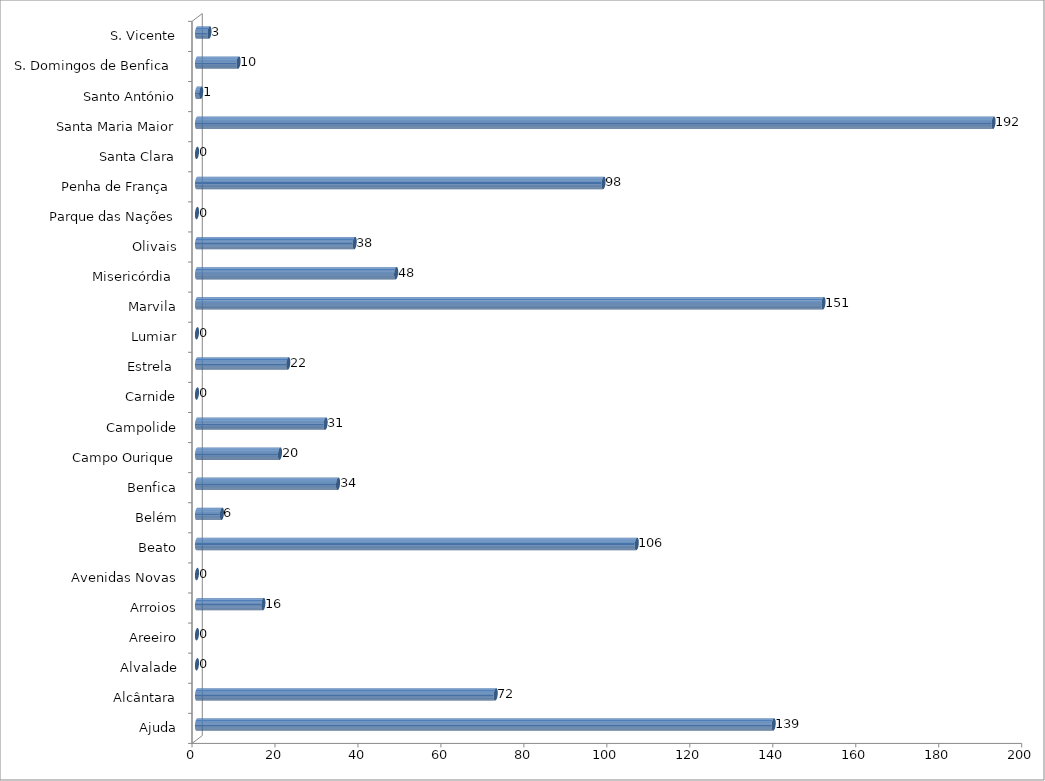
| Category | Series 0 |
|---|---|
| Ajuda | 139 |
| Alcântara | 72 |
| Alvalade | 0 |
| Areeiro | 0 |
| Arroios | 16 |
| Avenidas Novas | 0 |
| Beato | 106 |
| Belém | 6 |
| Benfica | 34 |
| Campo Ourique | 20 |
| Campolide | 31 |
| Carnide | 0 |
| Estrela  | 22 |
| Lumiar | 0 |
| Marvila | 151 |
| Misericórdia  | 48 |
| Olivais | 38 |
| Parque das Nações | 0 |
| Penha de França  | 98 |
| Santa Clara | 0 |
| Santa Maria Maior | 192 |
| Santo António | 1 |
| S. Domingos de Benfica  | 10 |
| S. Vicente | 3 |